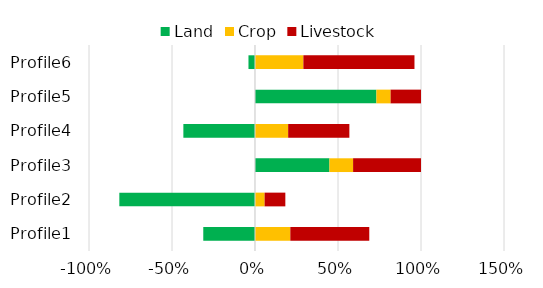
| Category | Land | Crop | Livestock |
|---|---|---|---|
| Profile1 | -0.312 | 0.213 | 0.476 |
| Profile2 | -0.817 | 0.058 | 0.125 |
| Profile3 | 0.449 | 0.142 | 0.409 |
| Profile4 | -0.432 | 0.2 | 0.369 |
| Profile5 | 0.731 | 0.085 | 0.183 |
| Profile6 | -0.039 | 0.291 | 0.669 |